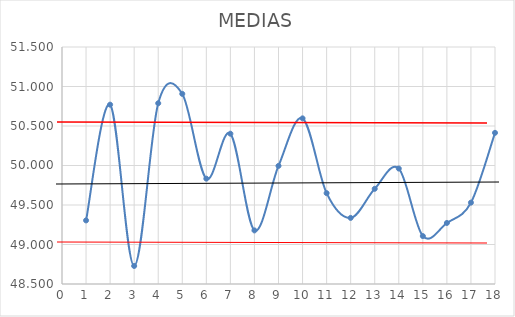
| Category | Series 0 |
|---|---|
| 1.0 | 49.305 |
| 2.0 | 50.77 |
| 3.0 | 48.728 |
| 4.0 | 50.788 |
| 5.0 | 50.907 |
| 6.0 | 49.833 |
| 7.0 | 50.402 |
| 8.0 | 49.178 |
| 9.0 | 49.995 |
| 10.0 | 50.597 |
| 11.0 | 49.65 |
| 12.0 | 49.337 |
| 13.0 | 49.705 |
| 14.0 | 49.962 |
| 15.0 | 49.107 |
| 16.0 | 49.272 |
| 17.0 | 49.53 |
| 18.0 | 50.413 |